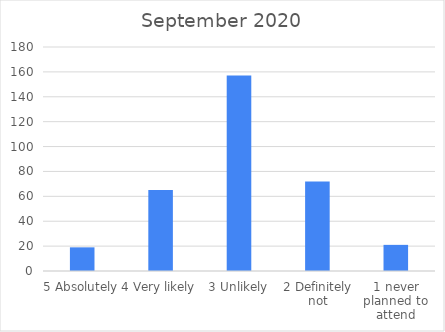
| Category | Series 0 |
|---|---|
| 5 Absolutely | 19 |
| 4 Very likely | 65 |
| 3 Unlikely | 157 |
| 2 Definitely not | 72 |
| 1 never planned to attend | 21 |